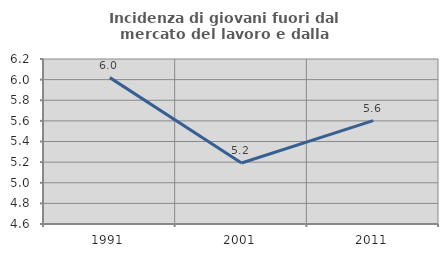
| Category | Incidenza di giovani fuori dal mercato del lavoro e dalla formazione  |
|---|---|
| 1991.0 | 6.019 |
| 2001.0 | 5.192 |
| 2011.0 | 5.602 |